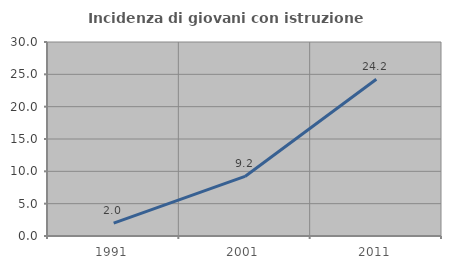
| Category | Incidenza di giovani con istruzione universitaria |
|---|---|
| 1991.0 | 2 |
| 2001.0 | 9.211 |
| 2011.0 | 24.242 |